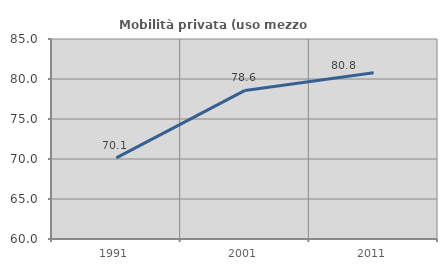
| Category | Mobilità privata (uso mezzo privato) |
|---|---|
| 1991.0 | 70.135 |
| 2001.0 | 78.571 |
| 2011.0 | 80.78 |